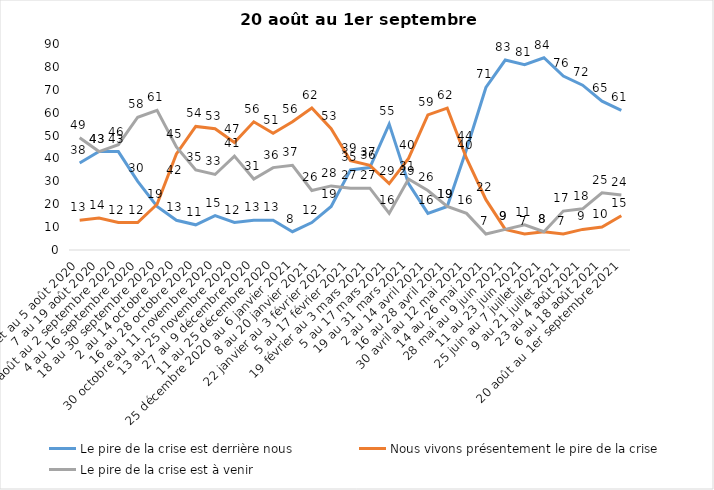
| Category | Le pire de la crise est derrière nous | Nous vivons présentement le pire de la crise | Le pire de la crise est à venir |
|---|---|---|---|
| 24 juillet au 5 août 2020 | 38 | 13 | 49 |
| 7 au 19 août 2020 | 43 | 14 | 43 |
| 21 août au 2 septembre 2020 | 43 | 12 | 46 |
| 4 au 16 septembre 2020 | 30 | 12 | 58 |
| 18 au 30 septembre 2020 | 19 | 20 | 61 |
| 2 au 14 octobre 2020 | 13 | 42 | 45 |
| 16 au 28 octobre 2020 | 11 | 54 | 35 |
| 30 octobre au 11 novembre 2020 | 15 | 53 | 33 |
| 13 au 25 novembre 2020 | 12 | 47 | 41 |
| 27 au 9 décembre 2020 | 13 | 56 | 31 |
| 11 au 25 décembre 2020 | 13 | 51 | 36 |
| 25 décembre 2020 au 6 janvier 2021 | 8 | 56 | 37 |
| 8 au 20 janvier 2021 | 12 | 62 | 26 |
| 22 janvier au 3 février 2021 | 19 | 53 | 28 |
| 5 au 17 février 2021 | 35 | 39 | 27 |
| 19 février au 3 mars 2021 | 36 | 37 | 27 |
| 5 au 17 mars 2021 | 55 | 29 | 16 |
| 19 au 31 mars 2021 | 29 | 40 | 31 |
| 2 au 14 avril 2021 | 16 | 59 | 26 |
| 16 au 28 avril 2021 | 19 | 62 | 19 |
| 30 avril au 12 mai 2021 | 44 | 40 | 16 |
| 14 au 26 mai 2021 | 71 | 22 | 7 |
| 28 mai au 9 juin 2021 | 83 | 9 | 9 |
| 11 au 23 juin 2021 | 81 | 7 | 11 |
| 25 juin au 7 juillet 2021 | 84 | 8 | 8 |
| 9 au 21 juillet 2021 | 76 | 7 | 17 |
| 23 au 4 août 2021 | 72 | 9 | 18 |
| 6 au 18 août 2021 | 65 | 10 | 25 |
| 20 août au 1er septembre 2021 | 61 | 15 | 24 |